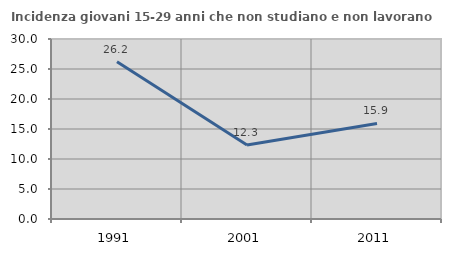
| Category | Incidenza giovani 15-29 anni che non studiano e non lavorano  |
|---|---|
| 1991.0 | 26.203 |
| 2001.0 | 12.327 |
| 2011.0 | 15.929 |